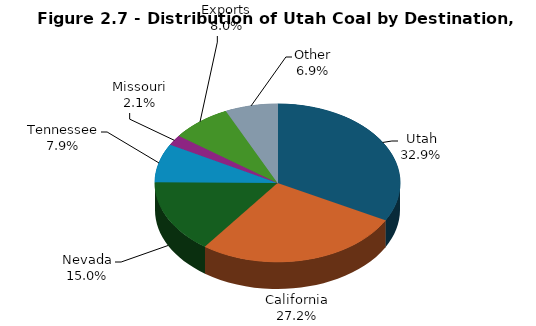
| Category | Series 0 |
|---|---|
| Utah | 8845 |
| California | 7322 |
| Nevada | 4045 |
| Tennessee | 2128 |
| Missouri | 565 |
| Exports | 2144 |
| Other | 1860 |